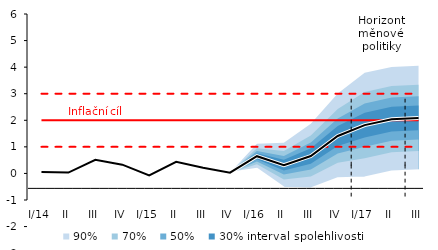
| Category | Inflation Target | Inflation Target - lower bound | Inflation Target - upper bound | linka | Střed předpovědi |
|---|---|---|---|---|---|
| I/14 | 2 | 1 | 3 | 0.053 | 0.053 |
| II | 2 | 1 | 3 | 0.032 | 0.032 |
| III | 2 | 1 | 3 | 0.511 | 0.511 |
| IV | 2 | 1 | 3 | 0.329 | 0.329 |
| I/15 | 2 | 1 | 3 | -0.076 | -0.076 |
| II | 2 | 1 | 3 | 0.439 | 0.439 |
| III | 2 | 1 | 3 | 0.212 | 0.212 |
| IV | 2 | 1 | 3 | 0.028 | 0.028 |
| I/16 | 2 | 1 | 3 | 0.648 | 0.648 |
| II | 2 | 1 | 3 | 0.309 | 0.309 |
| III | 2 | 1 | 3 | 0.655 | 0.655 |
| IV | 2 | 1 | 3 | 1.41 | 1.41 |
| I/17 | 2 | 1 | 3 | 1.818 | 1.818 |
| II | 2 | 1 | 3 | 2.042 | 2.042 |
| III | 2 | 1 | 3 | 2.089 | 2.089 |